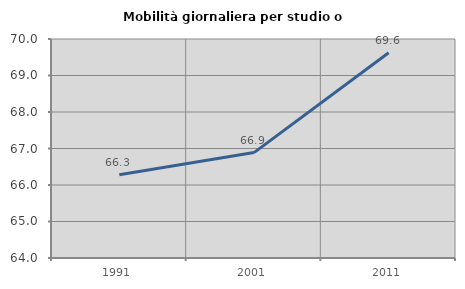
| Category | Mobilità giornaliera per studio o lavoro |
|---|---|
| 1991.0 | 66.282 |
| 2001.0 | 66.888 |
| 2011.0 | 69.623 |